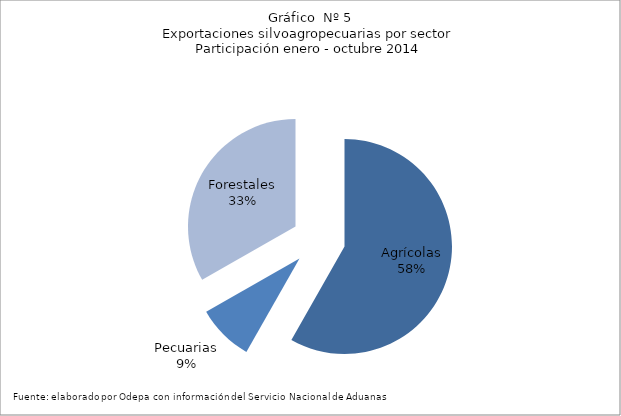
| Category | Series 0 |
|---|---|
| Agrícolas | 7839621 |
| Pecuarias | 1146042 |
| Forestales | 4478134 |